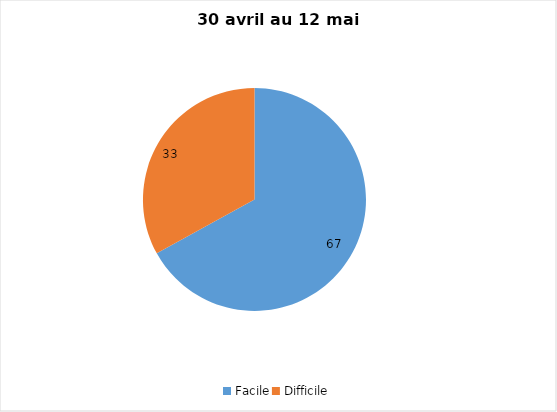
| Category | Series 0 |
|---|---|
| Facile | 67 |
| Difficile | 33 |